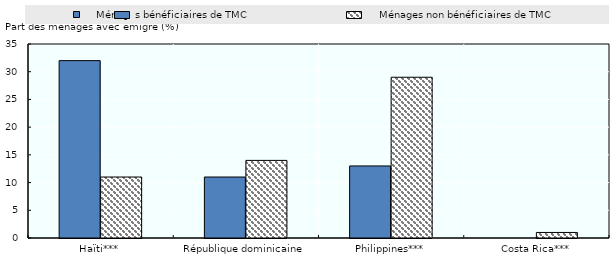
| Category |     Ménages bénéficiaires de TMC |       Ménages non bénéficiaires de TMC |
|---|---|---|
| Haïti*** | 32 | 11 |
| République dominicaine | 11 | 14 |
| Philippines*** | 13 | 29 |
| Costa Rica*** | 0 | 1 |